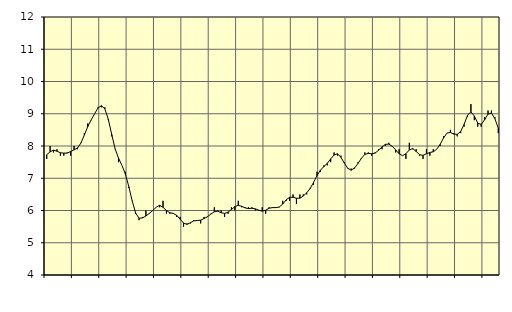
| Category | Piggar | Byggverksamhet, SNI 41-43 |
|---|---|---|
| nan | 7.6 | 7.73 |
| 87.0 | 8 | 7.82 |
| 87.0 | 7.8 | 7.87 |
| 87.0 | 7.9 | 7.84 |
| nan | 7.7 | 7.79 |
| 88.0 | 7.7 | 7.78 |
| 88.0 | 7.8 | 7.78 |
| 88.0 | 7.7 | 7.83 |
| nan | 8 | 7.88 |
| 89.0 | 7.9 | 7.94 |
| 89.0 | 8.1 | 8.09 |
| 89.0 | 8.4 | 8.34 |
| nan | 8.7 | 8.6 |
| 90.0 | 8.8 | 8.81 |
| 90.0 | 9 | 9 |
| 90.0 | 9.2 | 9.18 |
| nan | 9.2 | 9.25 |
| 91.0 | 9.2 | 9.15 |
| 91.0 | 8.8 | 8.83 |
| 91.0 | 8.3 | 8.36 |
| nan | 7.9 | 7.91 |
| 92.0 | 7.5 | 7.62 |
| 92.0 | 7.4 | 7.4 |
| 92.0 | 7.2 | 7.13 |
| nan | 6.7 | 6.74 |
| 93.0 | 6.3 | 6.29 |
| 93.0 | 5.9 | 5.92 |
| 93.0 | 5.7 | 5.76 |
| nan | 5.8 | 5.77 |
| 94.0 | 6 | 5.83 |
| 94.0 | 5.9 | 5.91 |
| 94.0 | 6 | 6 |
| nan | 6.1 | 6.1 |
| 95.0 | 6.1 | 6.16 |
| 95.0 | 6.3 | 6.1 |
| 95.0 | 5.9 | 6 |
| nan | 5.9 | 5.93 |
| 96.0 | 5.9 | 5.91 |
| 96.0 | 5.8 | 5.85 |
| 96.0 | 5.8 | 5.73 |
| nan | 5.5 | 5.61 |
| 97.0 | 5.6 | 5.57 |
| 97.0 | 5.6 | 5.62 |
| 97.0 | 5.7 | 5.68 |
| nan | 5.7 | 5.69 |
| 98.0 | 5.6 | 5.7 |
| 98.0 | 5.8 | 5.75 |
| 98.0 | 5.8 | 5.81 |
| nan | 5.9 | 5.89 |
| 99.0 | 6.1 | 5.96 |
| 99.0 | 6 | 5.98 |
| 99.0 | 6 | 5.93 |
| nan | 5.8 | 5.91 |
| 0.0 | 5.9 | 5.95 |
| 0.0 | 6.1 | 6.03 |
| 0.0 | 6 | 6.12 |
| nan | 6.3 | 6.16 |
| 1.0 | 6.1 | 6.13 |
| 1.0 | 6.1 | 6.08 |
| 1.0 | 6.1 | 6.06 |
| nan | 6.1 | 6.07 |
| 2.0 | 6 | 6.05 |
| 2.0 | 6 | 6.01 |
| 2.0 | 6.1 | 5.98 |
| nan | 5.9 | 6.01 |
| 3.0 | 6.1 | 6.07 |
| 3.0 | 6.1 | 6.09 |
| 3.0 | 6.1 | 6.09 |
| nan | 6.1 | 6.11 |
| 4.0 | 6.3 | 6.2 |
| 4.0 | 6.3 | 6.33 |
| 4.0 | 6.3 | 6.41 |
| nan | 6.5 | 6.41 |
| 5.0 | 6.2 | 6.38 |
| 5.0 | 6.5 | 6.38 |
| 5.0 | 6.5 | 6.45 |
| nan | 6.5 | 6.55 |
| 6.0 | 6.7 | 6.68 |
| 6.0 | 6.8 | 6.87 |
| 6.0 | 7.2 | 7.08 |
| nan | 7.2 | 7.25 |
| 7.0 | 7.4 | 7.36 |
| 7.0 | 7.4 | 7.46 |
| 7.0 | 7.5 | 7.6 |
| nan | 7.8 | 7.72 |
| 8.0 | 7.7 | 7.76 |
| 8.0 | 7.7 | 7.65 |
| 8.0 | 7.5 | 7.47 |
| nan | 7.3 | 7.31 |
| 9.0 | 7.3 | 7.25 |
| 9.0 | 7.3 | 7.32 |
| 9.0 | 7.5 | 7.46 |
| nan | 7.6 | 7.62 |
| 10.0 | 7.8 | 7.74 |
| 10.0 | 7.8 | 7.77 |
| 10.0 | 7.7 | 7.76 |
| nan | 7.8 | 7.78 |
| 11.0 | 7.9 | 7.87 |
| 11.0 | 7.9 | 7.97 |
| 11.0 | 8 | 8.05 |
| nan | 8.1 | 8.06 |
| 12.0 | 8 | 7.99 |
| 12.0 | 7.8 | 7.88 |
| 12.0 | 7.9 | 7.76 |
| nan | 7.7 | 7.7 |
| 13.0 | 7.6 | 7.76 |
| 13.0 | 8.1 | 7.88 |
| 13.0 | 7.9 | 7.92 |
| nan | 7.9 | 7.83 |
| 14.0 | 7.7 | 7.73 |
| 14.0 | 7.6 | 7.71 |
| 14.0 | 7.9 | 7.76 |
| nan | 7.7 | 7.8 |
| 15.0 | 7.9 | 7.82 |
| 15.0 | 7.9 | 7.9 |
| 15.0 | 8 | 8.05 |
| nan | 8.3 | 8.25 |
| 16.0 | 8.4 | 8.4 |
| 16.0 | 8.5 | 8.42 |
| 16.0 | 8.4 | 8.37 |
| nan | 8.3 | 8.36 |
| 17.0 | 8.4 | 8.45 |
| 17.0 | 8.6 | 8.67 |
| 17.0 | 8.9 | 8.95 |
| nan | 9.3 | 9.06 |
| 18.0 | 8.8 | 8.93 |
| 18.0 | 8.6 | 8.71 |
| 18.0 | 8.6 | 8.67 |
| nan | 8.9 | 8.81 |
| 19.0 | 9.1 | 8.99 |
| 19.0 | 9.1 | 9.02 |
| 19.0 | 8.9 | 8.85 |
| nan | 8.4 | 8.55 |